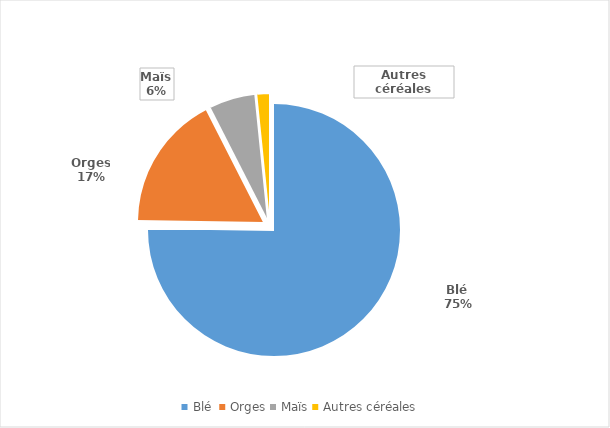
| Category | Series 0 |
|---|---|
| Blé  | 75.264 |
| Orges | 17.228 |
| Maïs | 5.901 |
| Autres céréales | 1.608 |